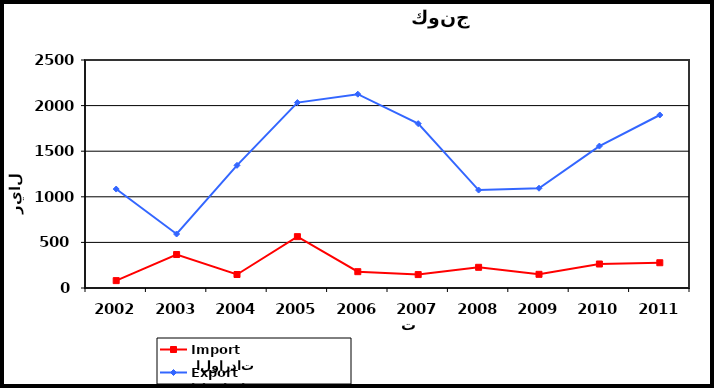
| Category |  الواردات           Import | الصادرات          Export |
|---|---|---|
| 2002.0 | 81 | 1085 |
| 2003.0 | 367 | 592 |
| 2004.0 | 148 | 1345 |
| 2005.0 | 563 | 2033 |
| 2006.0 | 179 | 2125 |
| 2007.0 | 147 | 1802 |
| 2008.0 | 227 | 1074 |
| 2009.0 | 150 | 1094 |
| 2010.0 | 263 | 1556 |
| 2011.0 | 277 | 1897 |